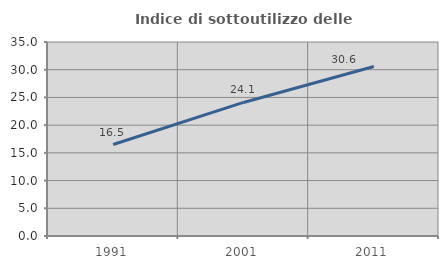
| Category | Indice di sottoutilizzo delle abitazioni  |
|---|---|
| 1991.0 | 16.502 |
| 2001.0 | 24.095 |
| 2011.0 | 30.59 |